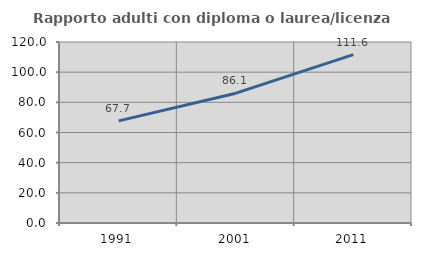
| Category | Rapporto adulti con diploma o laurea/licenza media  |
|---|---|
| 1991.0 | 67.729 |
| 2001.0 | 86.063 |
| 2011.0 | 111.646 |